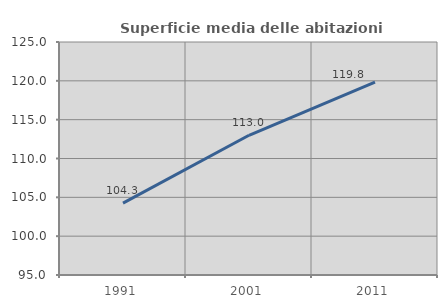
| Category | Superficie media delle abitazioni occupate |
|---|---|
| 1991.0 | 104.254 |
| 2001.0 | 112.991 |
| 2011.0 | 119.821 |